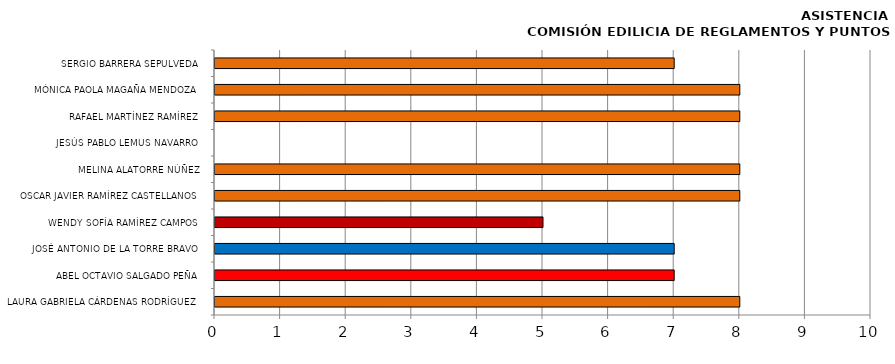
| Category | Series 0 |
|---|---|
| LAURA GABRIELA CÁRDENAS RODRÍGUEZ | 8 |
| ABEL OCTAVIO SALGADO PEÑA | 7 |
| JOSÉ ANTONIO DE LA TORRE BRAVO | 7 |
| WENDY SOFÍA RAMÍREZ CAMPOS | 5 |
| OSCAR JAVIER RAMÍREZ CASTELLANOS | 8 |
| MELINA ALATORRE NÚÑEZ | 8 |
| JESÚS PABLO LEMUS NAVARRO | 0 |
| RAFAEL MARTÍNEZ RAMÍREZ | 8 |
| MÓNICA PAOLA MAGAÑA MENDOZA | 8 |
| SERGIO BARRERA SEPULVEDA | 7 |